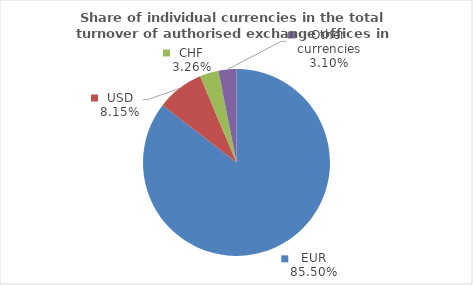
| Category | Series 0 |
|---|---|
| EUR | 85.497 |
| USD | 8.15 |
| CHF | 3.257 |
| Other currencies | 3.097 |